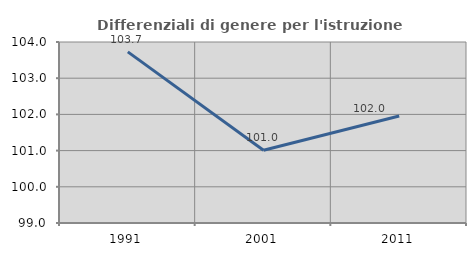
| Category | Differenziali di genere per l'istruzione superiore |
|---|---|
| 1991.0 | 103.727 |
| 2001.0 | 101.009 |
| 2011.0 | 101.956 |